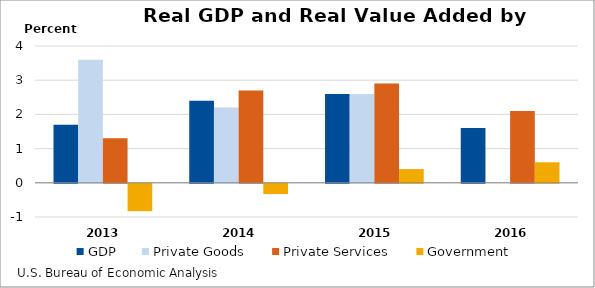
| Category | GDP | Private Goods | Private Services | Government |
|---|---|---|---|---|
| 2013.0 | 1.7 | 3.6 | 1.3 | -0.8 |
| 2014.0 | 2.4 | 2.2 | 2.7 | -0.3 |
| 2015.0 | 2.6 | 2.6 | 2.9 | 0.4 |
| 2016.0 | 1.6 | 0 | 2.1 | 0.6 |